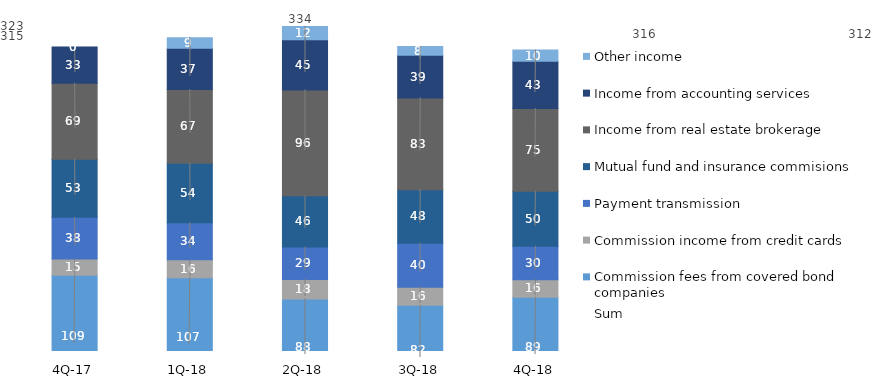
| Category | Commission fees from covered bond companies | Commission income from credit cards | Payment transmission | Mutual fund and insurance commisions | Income from real estate brokerage | Income from accounting services | Other income |
|---|---|---|---|---|---|---|---|
| 4Q-18 | 88.946 | 15.972 | 30.264 | 49.714 | 74.631 | 42.743 | 10.109 |
| 3Q-18 | 81.9 | 16.26 | 39.73 | 48.31 | 82.95 | 38.5 | 7.99 |
| 2Q-18 | 87.5 | 17.57 | 29.25 | 46.31 | 95.71 | 45.44 | 12 |
| 1Q-18 | 106.7 | 16.1 | 33.6 | 53.7 | 66.6 | 37.3 | 9.4 |
| 4Q-17 | 108.8 | 14.8 | 37.6 | 52.5 | 68.7 | 32.7 | 0 |